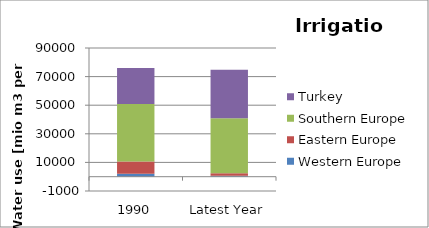
| Category | Western Europe | Eastern Europe | Southern Europe | Turkey |
|---|---|---|---|---|
| 1990 | 2001.7 | 8609.9 | 40291.6 | 25090 |
| Latest Year | 749.8 | 1596 | 38491.8 | 34035 |